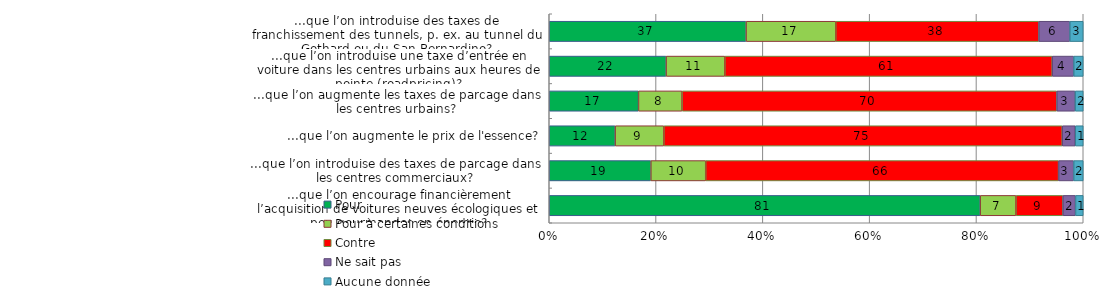
| Category | Pour | Pour à certaines conditions | Contre | Ne sait pas | Aucune donnée |
|---|---|---|---|---|---|
| ...que l’on introduise des taxes de franchissement des tunnels, p. ex. au tunnel du Gothard ou du San Bernardino? | 36.851 | 16.805 | 38.018 | 5.812 | 2.515 |
| ...que l’on introduise une taxe d’entrée en voiture dans les centres urbains aux heures de pointe (roadpricing)? | 21.88 | 11.007 | 61.296 | 4.033 | 1.784 |
| ...que l’on augmente les taxes de parcage dans les centres urbains? | 16.708 | 8.164 | 70.18 | 3.418 | 1.53 |
| ...que l’on augmente le prix de l'essence? | 12.337 | 9.129 | 74.593 | 2.446 | 1.495 |
| ...que l’on introduise des taxes de parcage dans les centres commerciaux? | 19.024 | 10.275 | 66.078 | 2.831 | 1.792 |
| ...que l’on encourage financièrement l’acquisition de voitures neuves écologiques et peu gourmandes en énergie? | 80.697 | 6.706 | 8.786 | 2.362 | 1.449 |